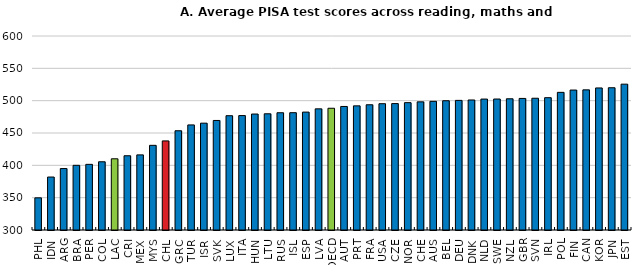
| Category | PISA |
|---|---|
| PHL | 349.731 |
| IDN | 381.901 |
| ARG | 395.009 |
| BRA | 400.021 |
| PER | 401.522 |
| COL | 405.517 |
| LAC | 410.114 |
| CRI | 414.817 |
| MEX | 416.158 |
| MYS | 430.935 |
| CHL | 437.754 |
| GRC | 453.472 |
| TUR | 462.48 |
| ISR | 465.215 |
| SVK | 469.399 |
| LUX | 476.725 |
| ITA | 476.962 |
| HUN | 479.327 |
| LTU | 479.711 |
| RUS | 481.335 |
| ISL | 481.395 |
| ESP | 482.322 |
| LVA | 487.359 |
| OECD | 488.259 |
| AUT | 491.038 |
| PRT | 491.989 |
| FRA | 493.664 |
| USA | 495.326 |
| CZE | 495.493 |
| NOR | 496.943 |
| CHE | 498.173 |
| AUS | 498.985 |
| BEL | 499.903 |
| DEU | 500.437 |
| DNK | 501.055 |
| NLD | 502.466 |
| SWE | 502.539 |
| NZL | 502.903 |
| GBR | 503.455 |
| SVN | 503.75 |
| IRL | 504.608 |
| POL | 512.846 |
| FIN | 516.422 |
| CAN | 516.7 |
| KOR | 519.664 |
| JPN | 519.988 |
| EST | 525.513 |